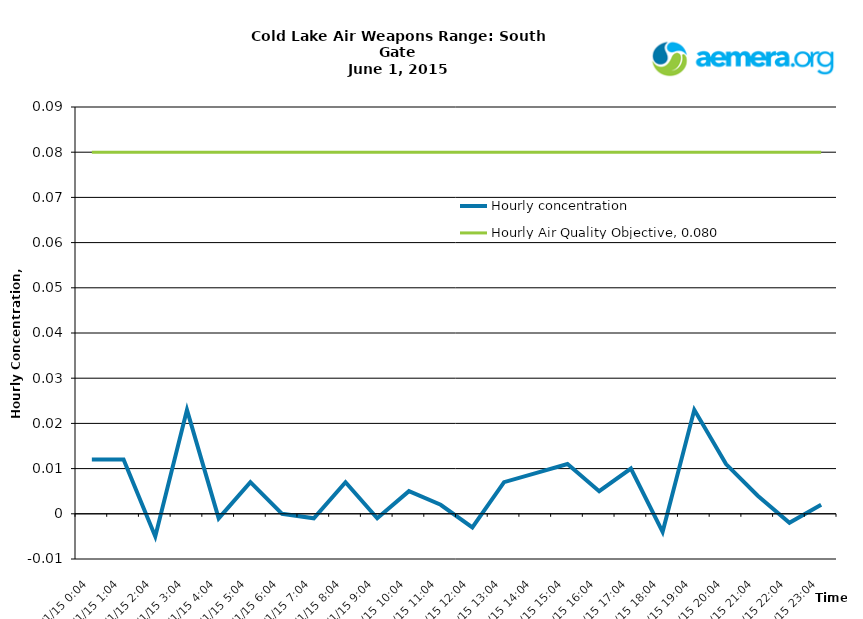
| Category | Hourly concentration | Hourly Air Quality Objective, 0.080 mg/m3 |
|---|---|---|
| 6/1/15 | 0.012 | 0.08 |
| 6/1/15 | 0.012 | 0.08 |
| 6/1/15 | -0.005 | 0.08 |
| 6/1/15 | 0.023 | 0.08 |
| 6/1/15 | -0.001 | 0.08 |
| 6/1/15 | 0.007 | 0.08 |
| 6/1/15 | 0 | 0.08 |
| 6/1/15 | -0.001 | 0.08 |
| 6/1/15 | 0.007 | 0.08 |
| 6/1/15 | -0.001 | 0.08 |
| 6/1/15 | 0.005 | 0.08 |
| 6/1/15 | 0.002 | 0.08 |
| 6/1/15 | -0.003 | 0.08 |
| 6/1/15 | 0.007 | 0.08 |
| 6/1/15 | 0.009 | 0.08 |
| 6/1/15 | 0.011 | 0.08 |
| 6/1/15 | 0.005 | 0.08 |
| 6/1/15 | 0.01 | 0.08 |
| 6/1/15 | -0.004 | 0.08 |
| 6/1/15 | 0.023 | 0.08 |
| 6/1/15 | 0.011 | 0.08 |
| 6/1/15 | 0.004 | 0.08 |
| 6/1/15 | -0.002 | 0.08 |
| 6/1/15 | 0.002 | 0.08 |